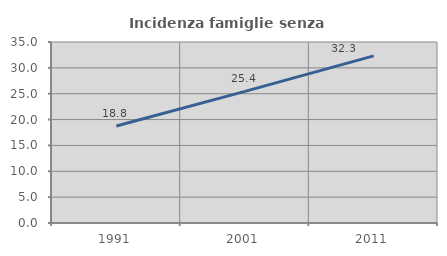
| Category | Incidenza famiglie senza nuclei |
|---|---|
| 1991.0 | 18.765 |
| 2001.0 | 25.444 |
| 2011.0 | 32.325 |